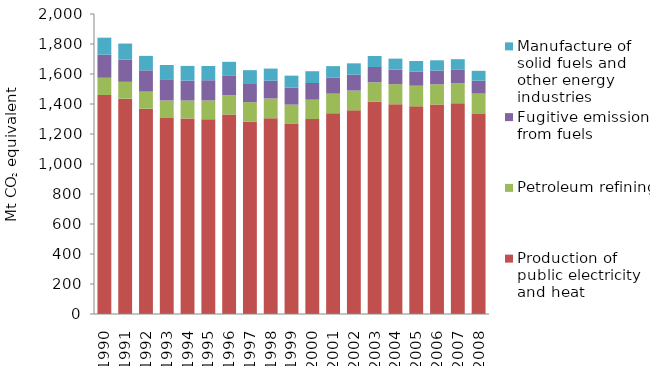
| Category | Production of public electricity and heat | Petroleum refining | Fugitive emissions from fuels | Manufacture of solid fuels and other energy industries |
|---|---|---|---|---|
| 1990 | 1460.237 | 114.635 | 154.023 | 113.271 |
| 1991 | 1435.535 | 112.33 | 147.411 | 107.75 |
| 1992 | 1368.58 | 113.898 | 141.821 | 96.606 |
| 1993 | 1306.278 | 117.284 | 141.283 | 95.346 |
| 1994 | 1303.799 | 119.344 | 132.914 | 97.922 |
| 1995 | 1298.411 | 125.229 | 134.685 | 94.907 |
| 1996 | 1329.841 | 128.396 | 132.862 | 90.164 |
| 1997 | 1281.468 | 130.866 | 126.179 | 87.074 |
| 1998 | 1304.438 | 132.389 | 118.378 | 80.907 |
| 1999 | 1269.171 | 126.608 | 114.103 | 79.136 |
| 2000 | 1299.599 | 129.136 | 111.383 | 78.351 |
| 2001 | 1338.068 | 130.865 | 108.032 | 75.525 |
| 2002 | 1357.901 | 131.742 | 105.744 | 75.663 |
| 2003 | 1414.094 | 130.54 | 102.002 | 73.536 |
| 2004 | 1398.106 | 134.091 | 97.239 | 73.069 |
| 2005 | 1384.183 | 137.82 | 94.428 | 70.076 |
| 2006 | 1396.86 | 134.397 | 91.839 | 68.264 |
| 2007 | 1404.733 | 134.884 | 88.001 | 71.153 |
| 2008 | 1333.248 | 136.234 | 86.017 | 65.729 |